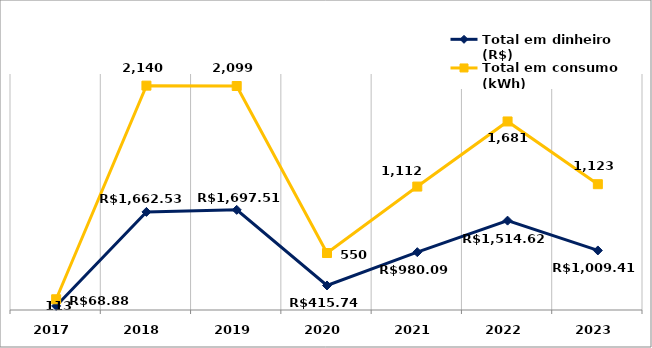
| Category | Total em dinheiro (R$) | Total em consumo (kWh) |
|---|---|---|
| 2017.0 | 68.88 | 113 |
| 2018.0 | 1662.53 | 2140 |
| 2019.0 | 1697.51 | 2099 |
| 2020.0 | 415.74 | 550 |
| 2021.0 | 980.09 | 1112 |
| 2022.0 | 1514.62 | 1681 |
| 2023.0 | 1009.41 | 1123 |